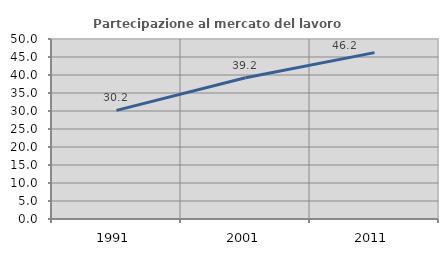
| Category | Partecipazione al mercato del lavoro  femminile |
|---|---|
| 1991.0 | 30.168 |
| 2001.0 | 39.221 |
| 2011.0 | 46.223 |